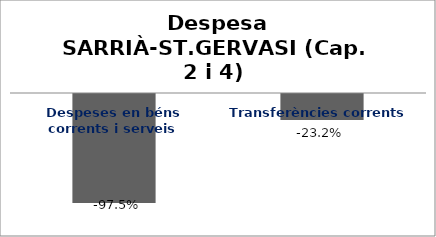
| Category | Series 0 |
|---|---|
| Despeses en béns corrents i serveis | -0.975 |
| Transferències corrents | -0.232 |